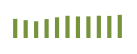
| Category | Saldo [ (1)-(2) ] |
|---|---|
| 0 | 532729.955 |
| 1 | 495602.949 |
| 2 | 464912.543 |
| 3 | 524886.84 |
| 4 | 575003.691 |
| 5 | 617133.535 |
| 6 | 598394.561 |
| 7 | 601130.812 |
| 8 | 618778.996 |
| 9 | 613706.598 |
| 10 | 643922.655 |